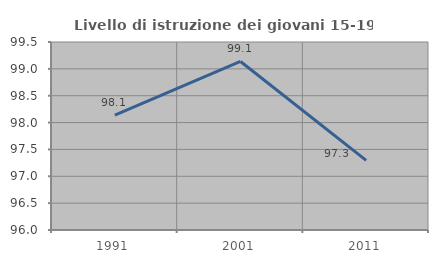
| Category | Livello di istruzione dei giovani 15-19 anni |
|---|---|
| 1991.0 | 98.14 |
| 2001.0 | 99.138 |
| 2011.0 | 97.297 |